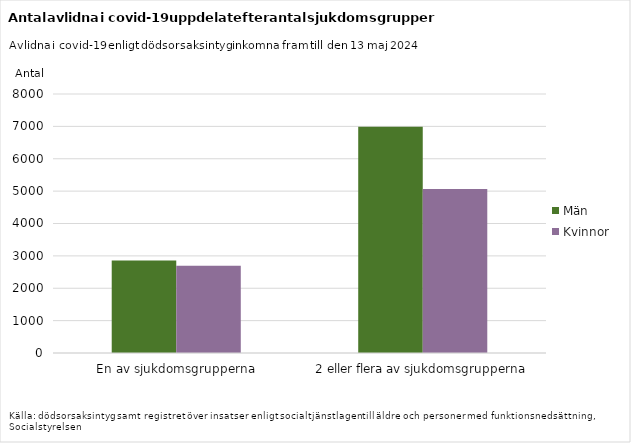
| Category | Män | Kvinnor |
|---|---|---|
| En av sjukdomsgrupperna | 2861 | 2693 |
| 2 eller flera av sjukdomsgrupperna | 6992 | 5068 |